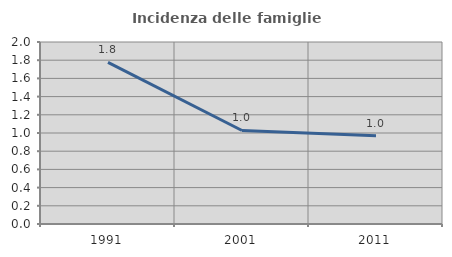
| Category | Incidenza delle famiglie numerose |
|---|---|
| 1991.0 | 1.777 |
| 2001.0 | 1.028 |
| 2011.0 | 0.971 |